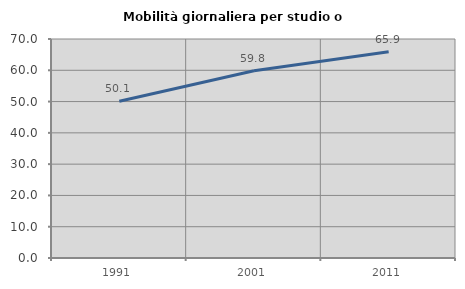
| Category | Mobilità giornaliera per studio o lavoro |
|---|---|
| 1991.0 | 50.121 |
| 2001.0 | 59.848 |
| 2011.0 | 65.909 |